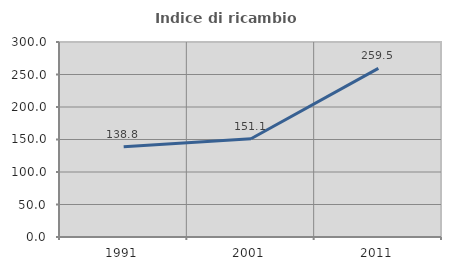
| Category | Indice di ricambio occupazionale  |
|---|---|
| 1991.0 | 138.77 |
| 2001.0 | 151.092 |
| 2011.0 | 259.511 |